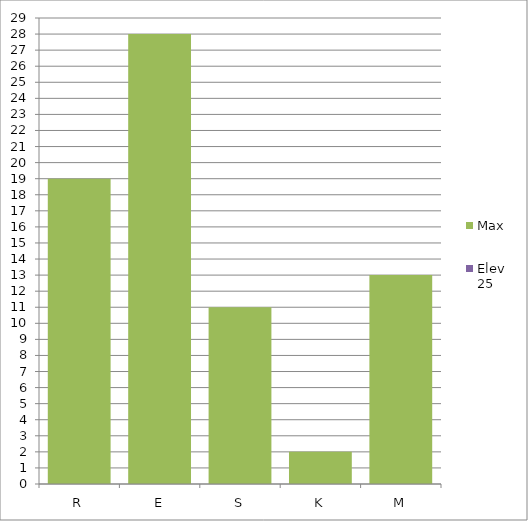
| Category | Max | Elev 25 |
|---|---|---|
| R | 19 | 0 |
| E | 28 | 0 |
| S | 11 | 0 |
| K | 2 | 0 |
| M | 13 | 0 |